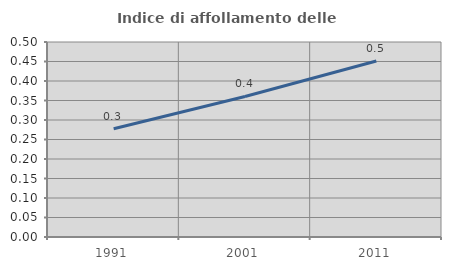
| Category | Indice di affollamento delle abitazioni  |
|---|---|
| 1991.0 | 0.278 |
| 2001.0 | 0.36 |
| 2011.0 | 0.451 |